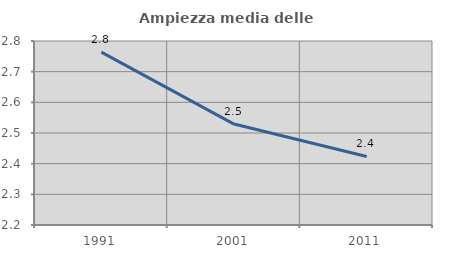
| Category | Ampiezza media delle famiglie |
|---|---|
| 1991.0 | 2.764 |
| 2001.0 | 2.529 |
| 2011.0 | 2.423 |